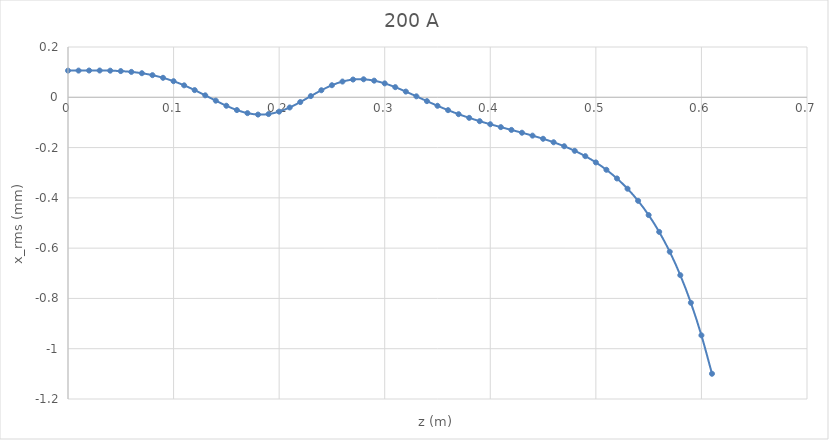
| Category | Series 0 |
|---|---|
| 0.0 | 0.106 |
| 0.01 | 0.106 |
| 0.02 | 0.106 |
| 0.03 | 0.106 |
| 0.04 | 0.106 |
| 0.05 | 0.104 |
| 0.06 | 0.101 |
| 0.07 | 0.096 |
| 0.08 | 0.088 |
| 0.09 | 0.078 |
| 0.1 | 0.064 |
| 0.11 | 0.048 |
| 0.12 | 0.029 |
| 0.13 | 0.008 |
| 0.14 | -0.013 |
| 0.15 | -0.034 |
| 0.16 | -0.051 |
| 0.17 | -0.063 |
| 0.18 | -0.069 |
| 0.19 | -0.067 |
| 0.2 | -0.057 |
| 0.21 | -0.041 |
| 0.22 | -0.019 |
| 0.23 | 0.005 |
| 0.24 | 0.028 |
| 0.25 | 0.048 |
| 0.26 | 0.063 |
| 0.27 | 0.071 |
| 0.28 | 0.072 |
| 0.29 | 0.066 |
| 0.3 | 0.055 |
| 0.31 | 0.04 |
| 0.32 | 0.023 |
| 0.33 | 0.004 |
| 0.34 | -0.015 |
| 0.35 | -0.034 |
| 0.36 | -0.051 |
| 0.37 | -0.067 |
| 0.38 | -0.082 |
| 0.39 | -0.095 |
| 0.4 | -0.107 |
| 0.41 | -0.119 |
| 0.42 | -0.13 |
| 0.43 | -0.141 |
| 0.44 | -0.153 |
| 0.45 | -0.165 |
| 0.46 | -0.179 |
| 0.47 | -0.195 |
| 0.48 | -0.213 |
| 0.49 | -0.234 |
| 0.5 | -0.259 |
| 0.51 | -0.288 |
| 0.52 | -0.323 |
| 0.53 | -0.364 |
| 0.54 | -0.412 |
| 0.55 | -0.468 |
| 0.56 | -0.535 |
| 0.57 | -0.614 |
| 0.58 | -0.707 |
| 0.59 | -0.817 |
| 0.6 | -0.947 |
| 0.61 | -1.1 |